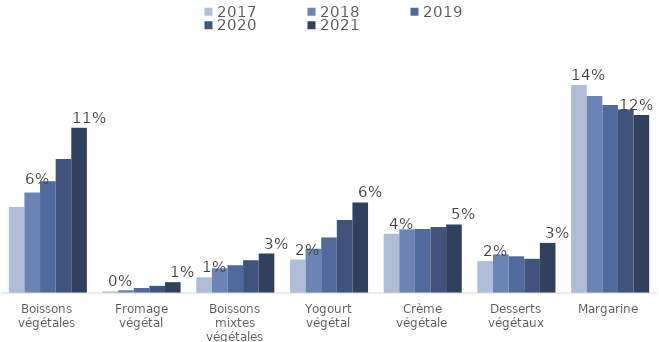
| Category | 2017 | 2018 | 2019 | 2020 | 2021 |
|---|---|---|---|---|---|
| Boissons végétales | 0.057 | 0.067 | 0.074 | 0.089 | 0.11 |
| Fromage végétal | 0.001 | 0.002 | 0.003 | 0.005 | 0.007 |
| Boissons mixtes végétales | 0.01 | 0.016 | 0.018 | 0.022 | 0.026 |
| Yogourt végétal | 0.022 | 0.029 | 0.037 | 0.049 | 0.06 |
| Crème végétale | 0.039 | 0.042 | 0.042 | 0.044 | 0.046 |
| Desserts végétaux | 0.021 | 0.026 | 0.024 | 0.023 | 0.033 |
| Margarine | 0.138 | 0.131 | 0.125 | 0.122 | 0.118 |